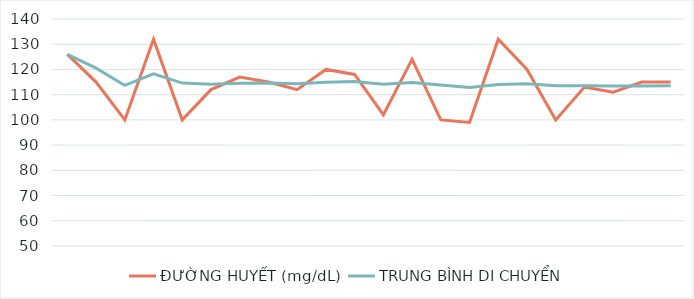
| Category | ĐƯỜNG HUYẾT (mg/dL) | TRUNG BÌNH DI CHUYỂN |
|---|---|---|
| 0 | 126 | 126 |
| 1 | 115 | 120.5 |
| 2 | 100 | 113.667 |
| 3 | 132 | 118.25 |
| 4 | 100 | 114.6 |
| 5 | 112 | 114.167 |
| 6 | 117 | 114.571 |
| 7 | 115 | 114.625 |
| 8 | 112 | 114.333 |
| 9 | 120 | 114.9 |
| 10 | 118 | 115.182 |
| 11 | 102 | 114.083 |
| 12 | 124 | 114.846 |
| 13 | 100 | 113.786 |
| 14 | 99 | 112.8 |
| 15 | 132 | 114 |
| 16 | 120 | 114.353 |
| 17 | 100 | 113.556 |
| 18 | 113 | 113.526 |
| 19 | 111 | 113.4 |
| 20 | 115 | 113.476 |
| 21 | 115 | 113.545 |